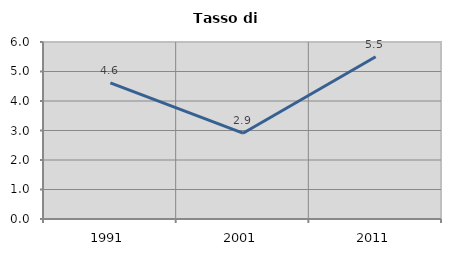
| Category | Tasso di disoccupazione   |
|---|---|
| 1991.0 | 4.614 |
| 2001.0 | 2.908 |
| 2011.0 | 5.5 |